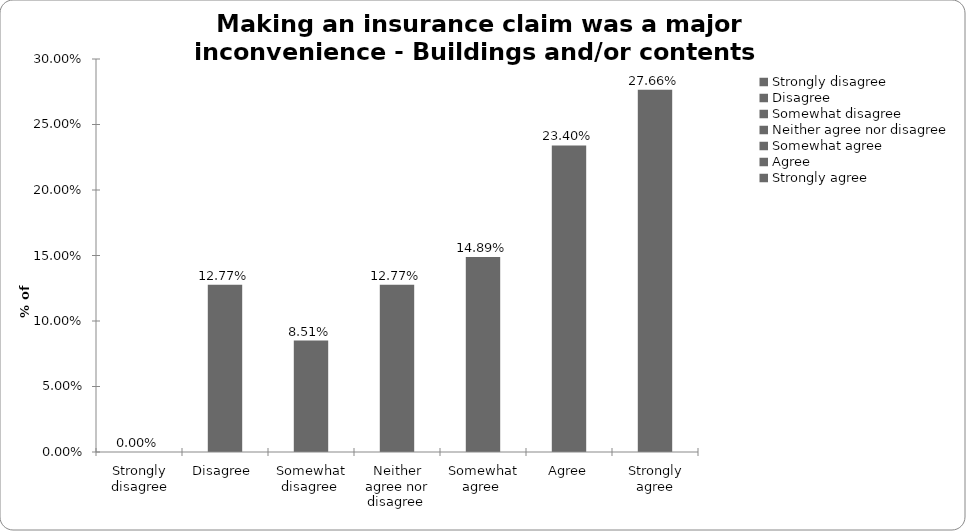
| Category | Series 0 |
|---|---|
| Strongly disagree | 0 |
| Disagree  | 0.128 |
| Somewhat disagree  | 0.085 |
| Neither agree nor disagree  | 0.128 |
| Somewhat agree  | 0.149 |
| Agree | 0.234 |
| Strongly agree | 0.277 |